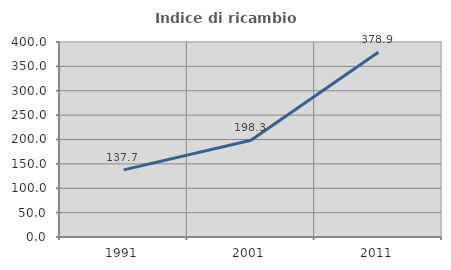
| Category | Indice di ricambio occupazionale  |
|---|---|
| 1991.0 | 137.681 |
| 2001.0 | 198.305 |
| 2011.0 | 378.947 |